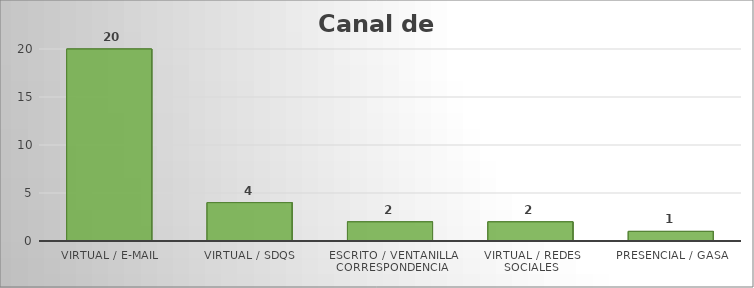
| Category | Series 0 |
|---|---|
| VIRTUAL / E-MAIL | 20 |
| VIRTUAL / SDQS | 4 |
| ESCRITO / VENTANILLA CORRESPONDENCIA | 2 |
| VIRTUAL / REDES SOCIALES | 2 |
| PRESENCIAL / GASA | 1 |